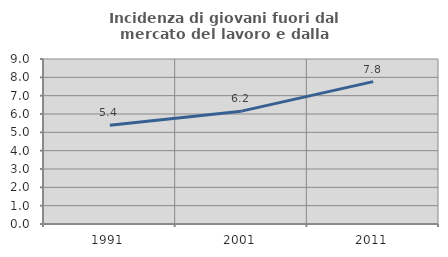
| Category | Incidenza di giovani fuori dal mercato del lavoro e dalla formazione  |
|---|---|
| 1991.0 | 5.388 |
| 2001.0 | 6.156 |
| 2011.0 | 7.767 |